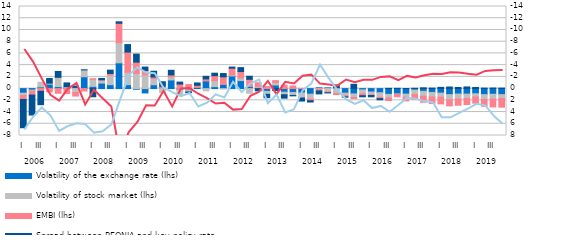
| Category | Volatility of the exchange rate (lhs) | Volatility of stock market (lhs) | EMBI (lhs) | Spread between BEONIA and key policy rate (lhs) |
|---|---|---|---|---|
| 0 | -0.78 | -0.4 | -0.671 | -4.821 |
| 1 | -0.256 | -0.205 | -0.64 | -3.415 |
| 2 | 0.291 | 0.788 | -0.461 | -2.281 |
| 3 | 0.751 | 0.174 | -0.568 | 0.79 |
| 4 | 0.342 | 1.58 | -0.798 | 1 |
| 5 | 0.202 | 0.125 | -0.858 | 0.639 |
| 6 | 0.256 | -0.661 | -0.617 | 0.169 |
| 7 | 2.016 | 1.167 | -0.413 | 0.016 |
| 8 | 0.381 | 1.213 | 0.09 | -1.394 |
| 9 | 0.938 | 0.493 | 0.072 | 0.23 |
| 10 | 0.672 | 1.614 | 0.293 | 0.567 |
| 11 | 4.393 | 3.436 | 3.313 | 0.248 |
| 12 | 0.667 | 2.114 | 3.447 | 1.275 |
| 13 | -0.122 | 2.582 | 1.93 | 1.37 |
| 14 | -0.741 | 2.347 | 0.751 | 0.571 |
| 15 | 0.656 | 1.035 | 0.285 | 0.982 |
| 16 | 0.216 | -0.667 | 0.178 | 0.77 |
| 17 | 1.472 | 0.515 | 0.347 | 0.786 |
| 18 | -0.214 | -0.818 | 0.765 | 0.343 |
| 19 | -0.204 | -0.369 | 0.688 | -0.119 |
| 20 | 0.255 | 0.011 | 0.295 | 0.398 |
| 21 | 1.304 | -0.392 | 0.347 | 0.44 |
| 22 | 0.332 | 1.002 | 0.867 | 0.424 |
| 23 | 0.703 | -0.06 | 1.3 | 0.56 |
| 24 | 2.159 | 0.165 | 1.152 | 0.194 |
| 25 | 1.361 | 0.459 | 1.088 | 0.668 |
| 26 | 0.363 | -0.804 | 1.221 | 0.521 |
| 27 | 0.005 | 0.302 | 0.7 | -0.383 |
| 28 | -0.48 | -0.499 | 0.331 | -0.579 |
| 29 | 0.604 | 0.452 | 0.307 | -0.331 |
| 30 | -0.618 | -0.432 | 0.574 | -0.584 |
| 31 | -0.671 | -0.497 | 0.443 | -0.069 |
| 32 | -0.748 | -0.85 | 0.026 | -0.527 |
| 33 | -0.956 | -0.825 | -0.288 | -0.222 |
| 34 | 0.136 | -0.115 | -0.281 | -0.51 |
| 35 | 0.12 | -0.55 | -0.158 | -0.024 |
| 36 | 0.154 | -0.84 | -0.184 | 0.459 |
| 37 | -0.774 | -0.366 | -0.26 | -0.059 |
| 38 | -0.907 | -0.628 | -0.186 | 0.731 |
| 39 | -0.221 | -0.658 | -0.335 | -0.188 |
| 40 | -0.58 | -0.484 | -0.119 | -0.22 |
| 41 | -0.704 | -0.789 | -0.217 | -0.202 |
| 42 | -0.984 | -0.627 | -0.428 | 0.042 |
| 43 | -0.899 | -0.097 | -0.4 | 0.046 |
| 44 | -0.935 | -0.533 | -0.629 | 0.016 |
| 45 | -0.248 | -0.753 | -0.868 | 0.054 |
| 46 | -0.474 | -0.838 | -1.01 | 0.131 |
| 47 | -0.655 | -0.773 | -1.121 | 0.086 |
| 48 | -0.776 | -0.688 | -1.145 | 0.21 |
| 49 | -1.029 | -0.891 | -1.035 | 0.268 |
| 50 | -0.929 | -0.84 | -1.072 | 0.183 |
| 51 | -0.939 | -0.762 | -1.021 | 0.28 |
| 52 | -0.878 | -0.55 | -1.061 | 0.195 |
| 53 | -1.03 | -0.821 | -1.161 | 0.082 |
| 54 | -0.964 | -0.84 | -1.322 | 0.097 |
| 55 | -1.033 | -0.652 | -1.486 | 0.083 |